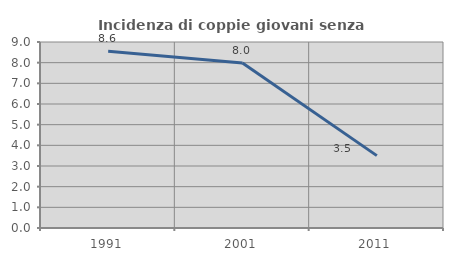
| Category | Incidenza di coppie giovani senza figli |
|---|---|
| 1991.0 | 8.551 |
| 2001.0 | 7.982 |
| 2011.0 | 3.503 |